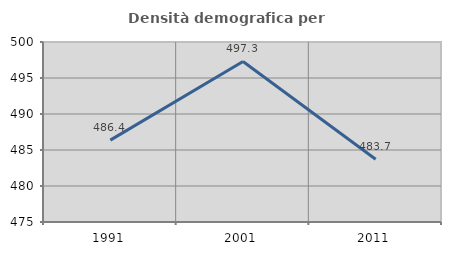
| Category | Densità demografica |
|---|---|
| 1991.0 | 486.375 |
| 2001.0 | 497.302 |
| 2011.0 | 483.715 |